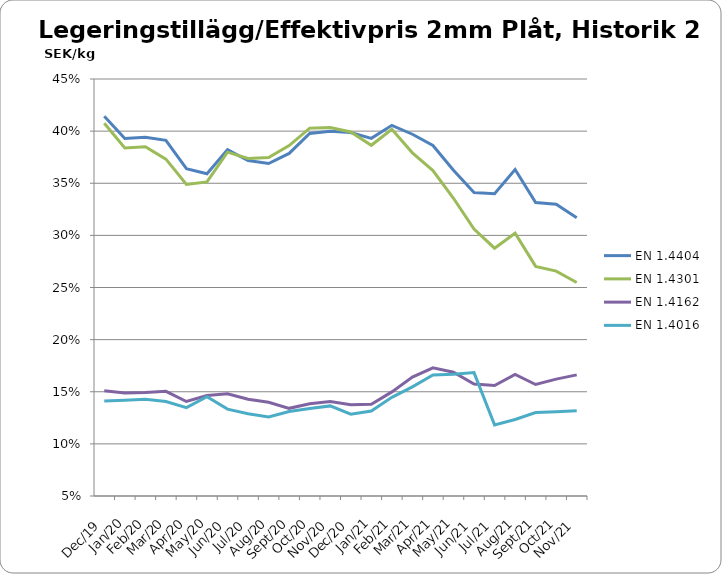
| Category | EN 1.4404 | EN 1.4301 | EN 1.4162  | EN 1.4016 |
|---|---|---|---|---|
| 2019-12-01 | 0.414 | 0.408 | 0.151 | 0.141 |
| 2020-01-01 | 0.393 | 0.384 | 0.149 | 0.142 |
| 2020-02-01 | 0.394 | 0.385 | 0.149 | 0.143 |
| 2020-03-01 | 0.391 | 0.373 | 0.15 | 0.141 |
| 2020-04-01 | 0.364 | 0.349 | 0.141 | 0.135 |
| 2020-05-01 | 0.359 | 0.351 | 0.146 | 0.145 |
| 2020-06-01 | 0.382 | 0.38 | 0.148 | 0.133 |
| 2020-07-01 | 0.372 | 0.374 | 0.143 | 0.129 |
| 2020-08-01 | 0.369 | 0.375 | 0.14 | 0.126 |
| 2020-09-01 | 0.379 | 0.386 | 0.134 | 0.131 |
| 2020-10-01 | 0.398 | 0.403 | 0.138 | 0.134 |
| 2020-11-01 | 0.4 | 0.403 | 0.141 | 0.136 |
| 2020-12-01 | 0.399 | 0.399 | 0.137 | 0.128 |
| 2021-01-01 | 0.393 | 0.386 | 0.138 | 0.131 |
| 2021-02-01 | 0.406 | 0.402 | 0.15 | 0.145 |
| 2021-03-01 | 0.397 | 0.379 | 0.164 | 0.155 |
| 2021-04-01 | 0.386 | 0.362 | 0.173 | 0.166 |
| 2021-05-01 | 0.363 | 0.336 | 0.169 | 0.167 |
| 2021-06-01 | 0.341 | 0.306 | 0.157 | 0.168 |
| 2021-07-01 | 0.34 | 0.288 | 0.156 | 0.118 |
| 2021-08-01 | 0.363 | 0.302 | 0.167 | 0.123 |
| 2021-09-01 | 0.332 | 0.27 | 0.157 | 0.13 |
| 2021-10-01 | 0.33 | 0.266 | 0.162 | 0.131 |
| 2021-11-01 | 0.317 | 0.255 | 0.166 | 0.132 |